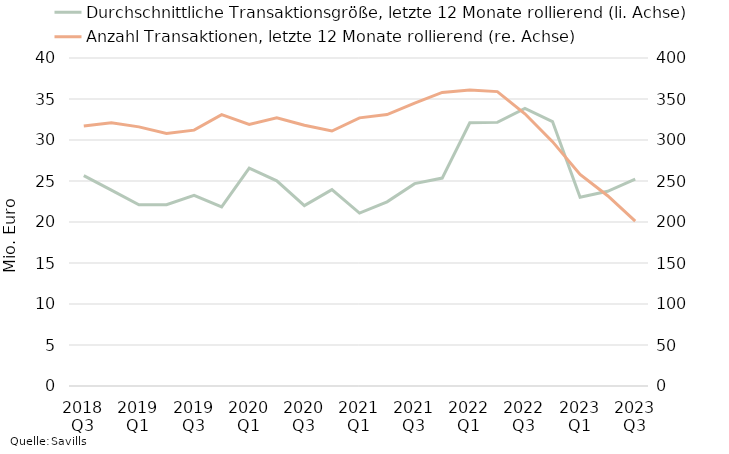
| Category | Durchschnittliche Transaktionsgröße, letzte 12 Monate rollierend (li. Achse) |
|---|---|
| 2018 Q3 | 25646187.502 |
| 2018 Q4 | 23884098.101 |
| 2019 Q1 | 22105124.01 |
| 2019 Q2 | 22110130.055 |
| 2019 Q3 | 23257657.317 |
| 2019 Q4 | 21833099.458 |
| 2020 Q1 | 26554944.117 |
| 2020 Q2 | 25018757.979 |
| 2020 Q3 | 21992255.042 |
| 2020 Q4 | 23943383.767 |
| 2021 Q1 | 21081233.96 |
| 2021 Q2 | 22461802.317 |
| 2021 Q3 | 24676724.725 |
| 2021 Q4 | 25356390.181 |
| 2022 Q1 | 32104461.537 |
| 2022 Q2 | 32149184.791 |
| 2022 Q3 | 33857164.632 |
| 2022 Q4 | 32242978.02 |
| 2023 Q1 | 23013020.484 |
| 2023 Q2 | 23741956.728 |
| 2023 Q3 | 25218294.069 |